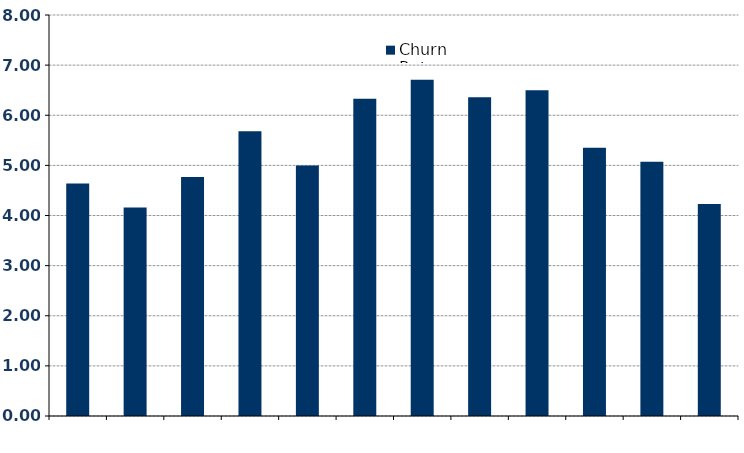
| Category | Churn Rate |
|---|---|
| 0 | 4.64 |
| 1900-01-01 | 4.16 |
| 1900-01-02 | 4.77 |
| 1900-01-03 | 5.68 |
| 1900-01-04 | 5 |
| 1900-01-05 | 6.33 |
| 1900-01-06 | 6.71 |
| 1900-01-07 | 6.36 |
| 1900-01-08 | 6.5 |
| 1900-01-09 | 5.35 |
| 1900-01-10 | 5.07 |
| 1900-01-11 | 4.23 |